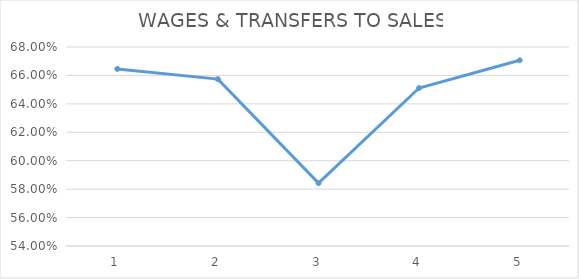
| Category | Series 0 |
|---|---|
| 0 | 0.665 |
| 1 | 0.657 |
| 2 | 0.584 |
| 3 | 0.651 |
| 4 | 0.671 |